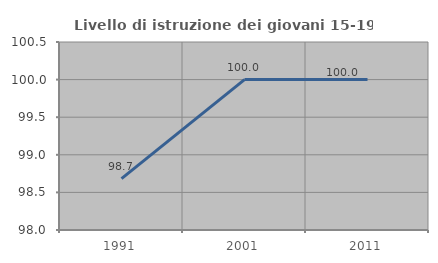
| Category | Livello di istruzione dei giovani 15-19 anni |
|---|---|
| 1991.0 | 98.684 |
| 2001.0 | 100 |
| 2011.0 | 100 |